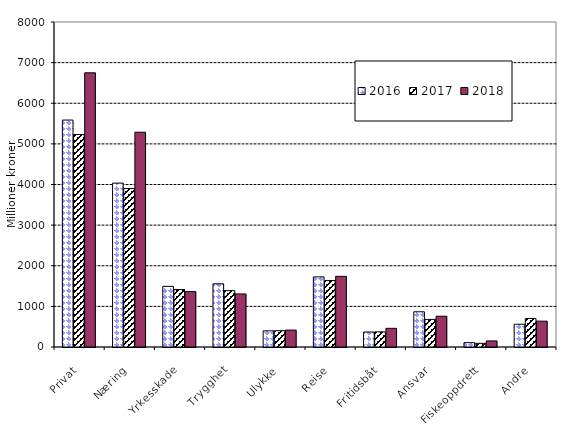
| Category | 2016 | 2017 | 2018 |
|---|---|---|---|
| Privat | 5586.44 | 5230.898 | 6749.281 |
| Næring | 4034.605 | 3900.552 | 5286.983 |
| Yrkesskade | 1493.239 | 1415.348 | 1363.784 |
| Trygghet | 1556.112 | 1387.375 | 1305.469 |
| Ulykke | 397.935 | 401.153 | 416.25 |
| Reise | 1725.945 | 1637.637 | 1739.103 |
| Fritidsbåt | 368.91 | 372.496 | 459.968 |
| Ansvar | 866.963 | 679.319 | 757.478 |
| Fiskeoppdrett | 107.127 | 89.79 | 149.75 |
| Andre | 559.916 | 702.456 | 636.403 |